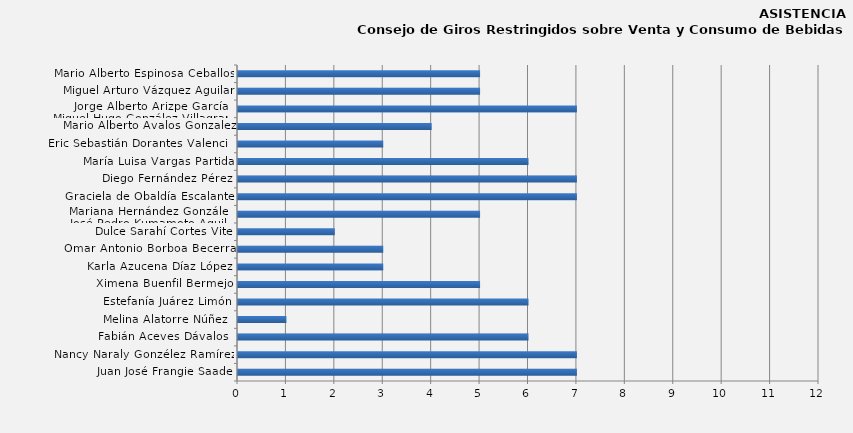
| Category | Juan José Frangie Saade |
|---|---|
| Juan José Frangie Saade | 7 |
| Nancy Naraly Gonzélez Ramírez | 7 |
| Fabián Aceves Dávalos  | 6 |
| Melina Alatorre Núñez  | 1 |
| Estefanía Juárez Limón | 6 |
| Ximena Buenfil Bermejo | 5 |
| Karla Azucena Díaz López | 3 |
| Omar Antonio Borboa Becerra | 3 |
| Dulce Sarahí Cortes Vite | 2 |
| Mariana Hernández González/
José Pedro Kumamoto Aguilar | 5 |
| Graciela de Obaldía Escalante | 7 |
| Diego Fernández Pérez | 7 |
| María Luisa Vargas Partida | 6 |
| Eric Sebastián Dorantes Valencia | 3 |
| Mario Alberto Avalos Gonzalez | 4 |
| Jorge Alberto Arizpe García / 
Miguel Hugo González Villagrana | 7 |
| Miguel Arturo Vázquez Aguilar | 5 |
| Mario Alberto Espinosa Ceballos | 5 |